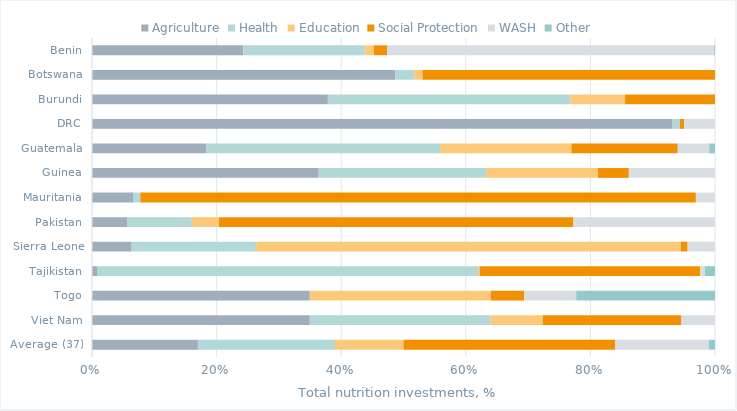
| Category | Agriculture | Health | Education | Social Protection | WASH | Other |
|---|---|---|---|---|---|---|
| Average (37) | 0.17 | 0.22 | 0.11 | 0.34 | 0.15 | 0.01 |
| Viet Nam | 0.35 | 0.29 | 0.083 | 0.223 | 0.054 | 0 |
| Togo | 0.35 | 0 | 0.29 | 0.054 | 0.083 | 0.223 |
| Tajikistan | 0.009 | 0.612 | 0.001 | 0.354 | 0.007 | 0.016 |
| Sierra Leone | 0.064 | 0.2 | 0.682 | 0.011 | 0.044 | 0 |
| Pakistan | 0.057 | 0.103 | 0.043 | 0.569 | 0.227 | 0 |
| Mauritania | 0.067 | 0.01 | 0 | 0.892 | 0.031 | 0 |
| Guinea | 0.364 | 0.269 | 0.179 | 0.05 | 0.138 | 0 |
| Guatemala | 0.183 | 0.376 | 0.211 | 0.171 | 0.05 | 0.009 |
| DRC | 0.931 | 0.013 | 0 | 0.007 | 0.049 | 0 |
| Burundi | 0.379 | 0.389 | 0.088 | 0.144 | 0 | 0 |
| Botswana | 0.487 | 0.03 | 0.013 | 0.469 | 0 | 0 |
| Benin | 0.243 | 0.194 | 0.015 | 0.021 | 0.524 | 0.001 |